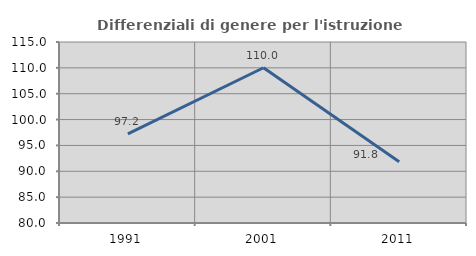
| Category | Differenziali di genere per l'istruzione superiore |
|---|---|
| 1991.0 | 97.22 |
| 2001.0 | 110.021 |
| 2011.0 | 91.827 |